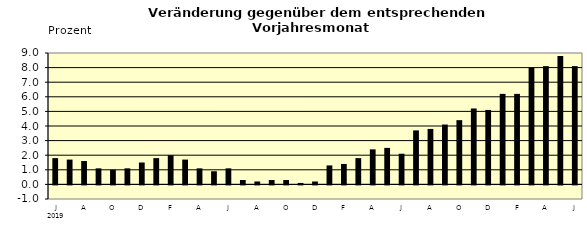
| Category | Series 0 |
|---|---|
| 0 | 1.8 |
| 1 | 1.7 |
| 2 | 1.6 |
| 3 | 1.1 |
| 4 | 1 |
| 5 | 1.1 |
| 6 | 1.5 |
| 7 | 1.8 |
| 8 | 2 |
| 9 | 1.7 |
| 10 | 1.1 |
| 11 | 0.9 |
| 12 | 1.1 |
| 13 | 0.3 |
| 14 | 0.2 |
| 15 | 0.3 |
| 16 | 0.3 |
| 17 | 0.1 |
| 18 | 0.2 |
| 19 | 1.3 |
| 20 | 1.4 |
| 21 | 1.8 |
| 22 | 2.4 |
| 23 | 2.5 |
| 24 | 2.1 |
| 25 | 3.7 |
| 26 | 3.8 |
| 27 | 4.1 |
| 28 | 4.4 |
| 29 | 5.2 |
| 30 | 5.1 |
| 31 | 6.2 |
| 32 | 6.2 |
| 33 | 8 |
| 34 | 8.1 |
| 35 | 8.8 |
| 36 | 8.1 |